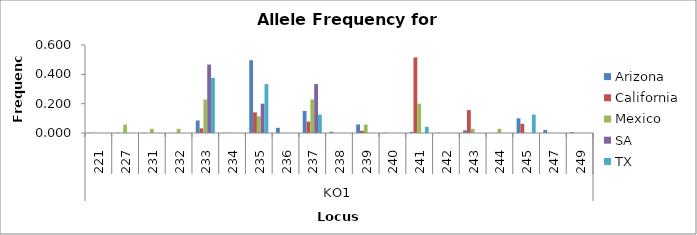
| Category | Arizona | California | Mexico | SA | TX |
|---|---|---|---|---|---|
| 0 | 0.002 | 0 | 0 | 0 | 0 |
| 1 | 0.002 | 0 | 0.057 | 0 | 0 |
| 2 | 0.002 | 0 | 0.029 | 0 | 0 |
| 3 | 0 | 0 | 0.029 | 0 | 0 |
| 4 | 0.085 | 0.031 | 0.229 | 0.467 | 0.375 |
| 5 | 0.002 | 0 | 0 | 0 | 0 |
| 6 | 0.496 | 0.141 | 0.114 | 0.2 | 0.333 |
| 7 | 0.035 | 0 | 0 | 0 | 0 |
| 8 | 0.15 | 0.078 | 0.229 | 0.333 | 0.125 |
| 9 | 0.008 | 0 | 0 | 0 | 0 |
| 10 | 0.058 | 0.016 | 0.057 | 0 | 0 |
| 11 | 0.002 | 0 | 0 | 0 | 0 |
| 12 | 0.008 | 0.516 | 0.2 | 0 | 0.042 |
| 13 | 0.002 | 0 | 0 | 0 | 0 |
| 14 | 0.019 | 0.156 | 0.029 | 0 | 0 |
| 15 | 0 | 0 | 0.029 | 0 | 0 |
| 16 | 0.1 | 0.062 | 0 | 0 | 0.125 |
| 17 | 0.021 | 0 | 0 | 0 | 0 |
| 18 | 0.006 | 0 | 0 | 0 | 0 |